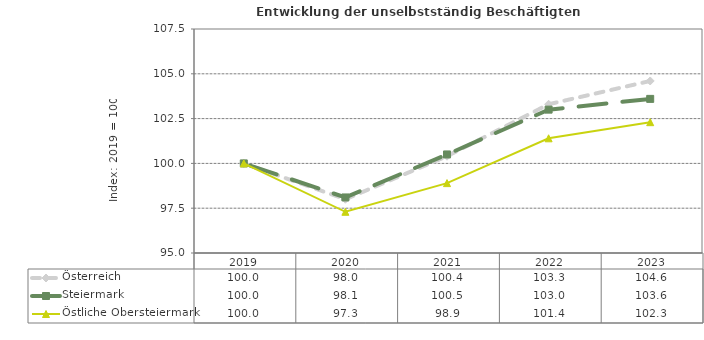
| Category | Österreich | Steiermark | Östliche Obersteiermark |
|---|---|---|---|
| 2023.0 | 104.6 | 103.6 | 102.3 |
| 2022.0 | 103.3 | 103 | 101.4 |
| 2021.0 | 100.4 | 100.5 | 98.9 |
| 2020.0 | 98 | 98.1 | 97.3 |
| 2019.0 | 100 | 100 | 100 |